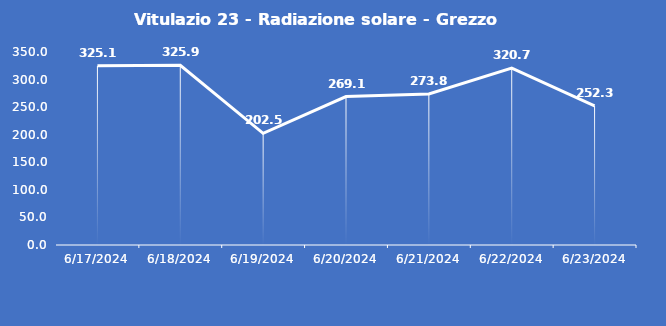
| Category | Vitulazio 23 - Radiazione solare - Grezzo (W/m2) |
|---|---|
| 6/17/24 | 325.1 |
| 6/18/24 | 325.9 |
| 6/19/24 | 202.5 |
| 6/20/24 | 269.1 |
| 6/21/24 | 273.8 |
| 6/22/24 | 320.7 |
| 6/23/24 | 252.3 |